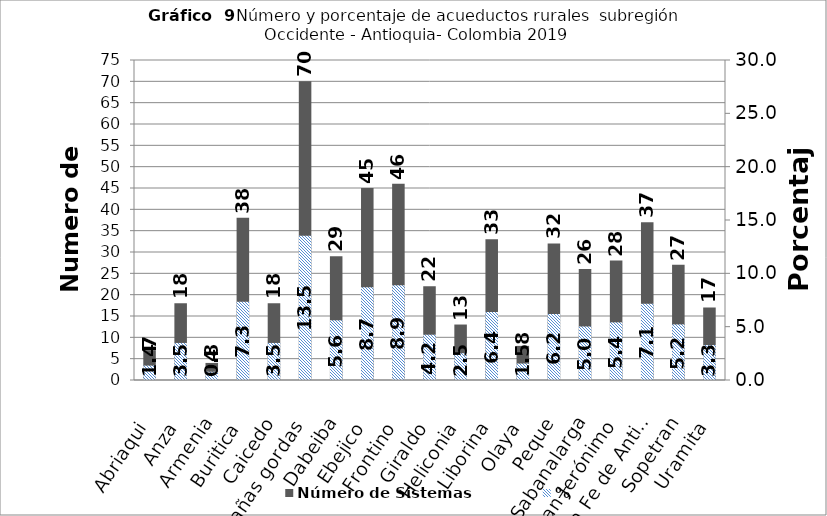
| Category | Número de Sistemas |
|---|---|
| Abriaqui | 7 |
| Anza | 18 |
| Armenia | 4 |
| Buritica | 38 |
| Caicedo | 18 |
| Cañas gordas | 70 |
| Dabeiba | 29 |
| Ebejico | 45 |
| Frontino | 46 |
| Giraldo | 22 |
| Heliconia | 13 |
| Liborina | 33 |
| Olaya | 8 |
| Peque | 32 |
| Sabanalarga | 26 |
| San Jerónimo | 28 |
| Santa Fe de Antioquia | 37 |
| Sopetran | 27 |
| Uramita | 17 |